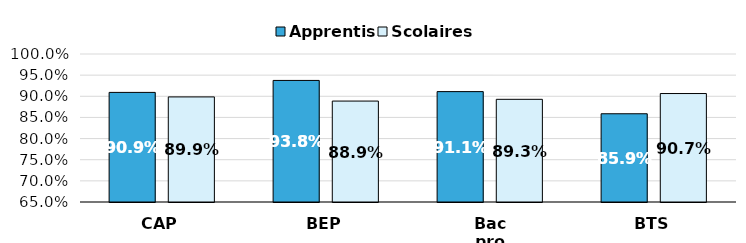
| Category | Apprentis | Scolaires |
|---|---|---|
| CAP | 0.909 | 0.899 |
| BEP | 0.938 | 0.889 |
| Bac pro | 0.911 | 0.893 |
| BTS | 0.859 | 0.907 |